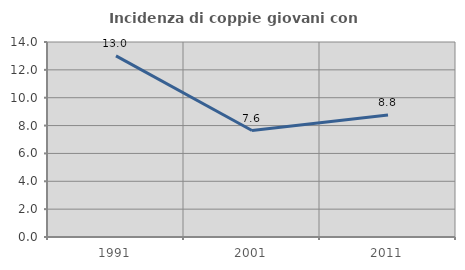
| Category | Incidenza di coppie giovani con figli |
|---|---|
| 1991.0 | 13.005 |
| 2001.0 | 7.643 |
| 2011.0 | 8.765 |